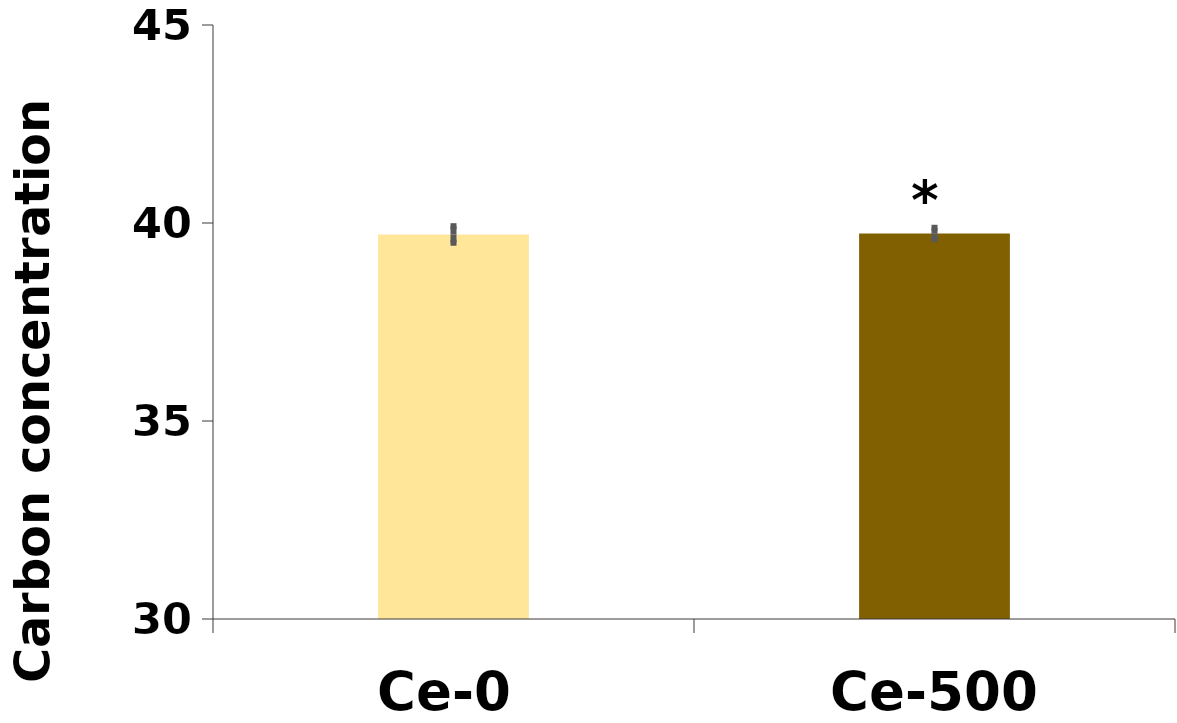
| Category | %C |
|---|---|
| Ce-0 | 39.71 |
| Ce-500 | 39.736 |